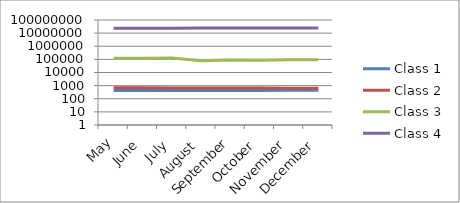
| Category | Class 1 | Class 2 | Class 3 | Class 4 |
|---|---|---|---|---|
| May | 420 | 686 | 121241 | 23988139 |
| June | 422 | 687 | 123483 | 24005430 |
| July | 427 | 658 | 125491 | 24038014 |
| August | 427 | 655 | 78827 | 24101362 |
| September | 429 | 650 | 88860 | 24110132 |
| October | 433 | 645 | 87615 | 24128941 |
| November | 437 | 636 | 95286 | 24146202 |
| December | 438 | 639 | 95544 | 24160382 |